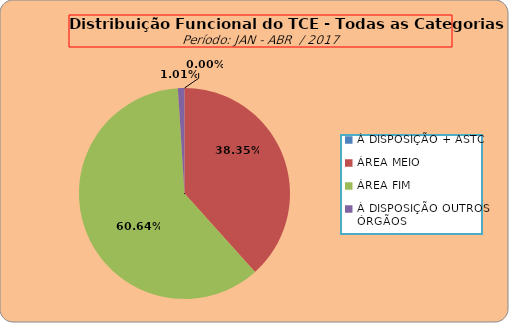
| Category | Series 0 |
|---|---|
| À DISPOSIÇÃO + ASTC | 0 |
| ÁREA MEIO | 191 |
| ÁREA FIM | 302 |
| À DISPOSIÇÃO OUTROS ÓRGÃOS | 5 |